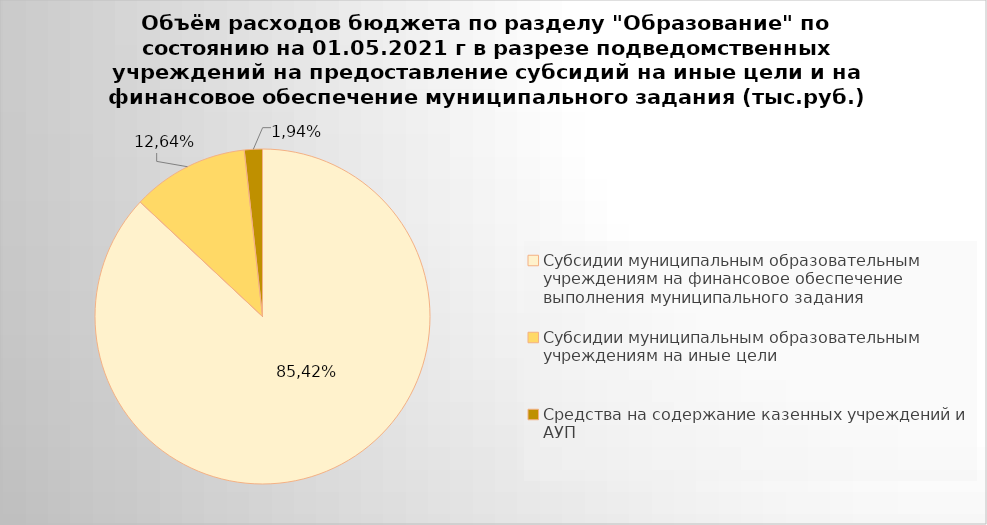
| Category | Series 0 |
|---|---|
| Субсидии муниципальным образовательным учреждениям на финансовое обеспечение выполнения муниципального задания | 5157846.54 |
| Субсидии муниципальным образовательным учреждениям на иные цели | 669500.9 |
| Средства на содержание казенных учреждений и АУП | 103387.06 |